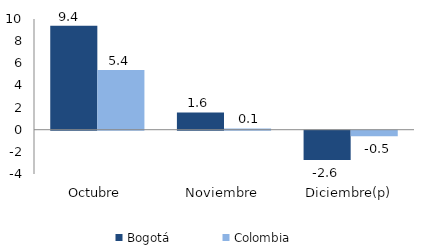
| Category | Bogotá | Colombia |
|---|---|---|
| Octubre | 9.396 | 5.396 |
| Noviembre | 1.555 | 0.111 |
| Diciembre(p) | -2.637 | -0.509 |